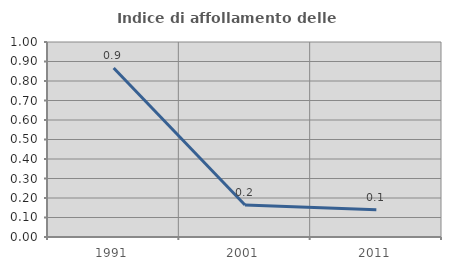
| Category | Indice di affollamento delle abitazioni  |
|---|---|
| 1991.0 | 0.867 |
| 2001.0 | 0.164 |
| 2011.0 | 0.14 |